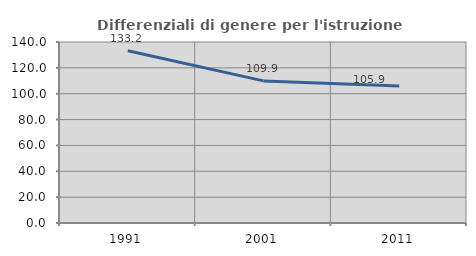
| Category | Differenziali di genere per l'istruzione superiore |
|---|---|
| 1991.0 | 133.23 |
| 2001.0 | 109.928 |
| 2011.0 | 105.899 |